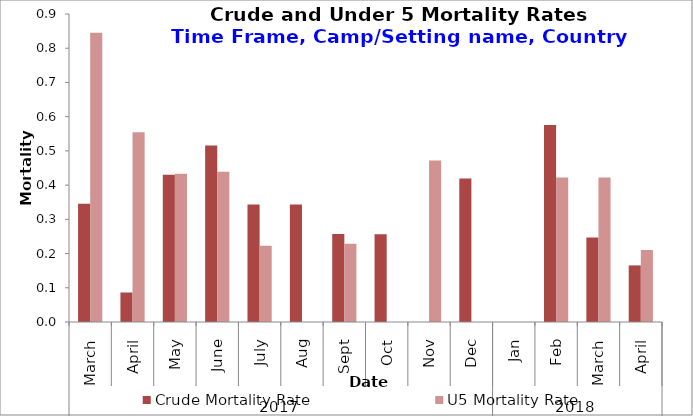
| Category | Crude Mortality Rate | U5 Mortality Rate |
|---|---|---|
| 0 | 0.346 | 0.845 |
| 1 | 0.086 | 0.555 |
| 2 | 0.431 | 0.433 |
| 3 | 0.516 | 0.439 |
| 4 | 0.344 | 0.223 |
| 5 | 0.343 | 0 |
| 6 | 0.257 | 0.229 |
| 7 | 0.256 | 0 |
| 8 | 0 | 0.472 |
| 9 | 0.42 | 0 |
| 10 | 0 | 0 |
| 11 | 0.576 | 0.422 |
| 12 | 0.247 | 0.422 |
| 13 | 0.165 | 0.211 |